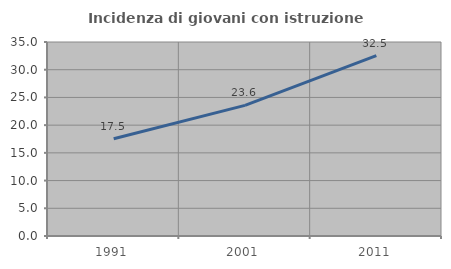
| Category | Incidenza di giovani con istruzione universitaria |
|---|---|
| 1991.0 | 17.544 |
| 2001.0 | 23.569 |
| 2011.0 | 32.54 |